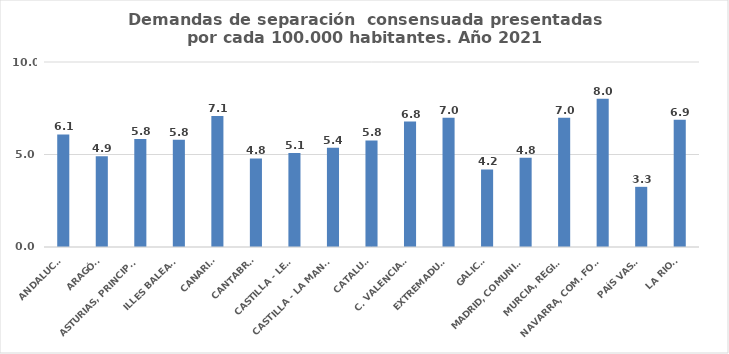
| Category | Series 0 |
|---|---|
| ANDALUCÍA | 6.086 |
| ARAGÓN | 4.901 |
| ASTURIAS, PRINCIPADO | 5.831 |
| ILLES BALEARS | 5.797 |
| CANARIAS | 7.087 |
| CANTABRIA | 4.79 |
| CASTILLA - LEÓN | 5.077 |
| CASTILLA - LA MANCHA | 5.367 |
| CATALUÑA | 5.758 |
| C. VALENCIANA | 6.781 |
| EXTREMADURA | 6.984 |
| GALICIA | 4.192 |
| MADRID, COMUNIDAD | 4.829 |
| MURCIA, REGIÓN | 6.981 |
| NAVARRA, COM. FORAL | 8.012 |
| PAÍS VASCO | 3.252 |
| LA RIOJA | 6.879 |